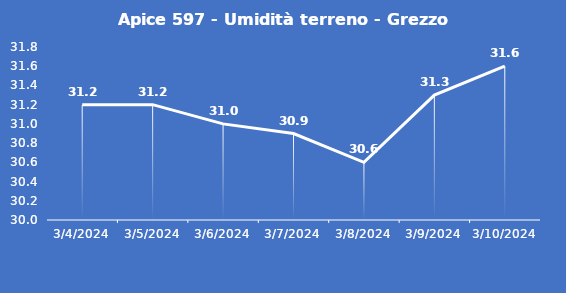
| Category | Apice 597 - Umidità terreno - Grezzo (%VWC) |
|---|---|
| 3/4/24 | 31.2 |
| 3/5/24 | 31.2 |
| 3/6/24 | 31 |
| 3/7/24 | 30.9 |
| 3/8/24 | 30.6 |
| 3/9/24 | 31.3 |
| 3/10/24 | 31.6 |